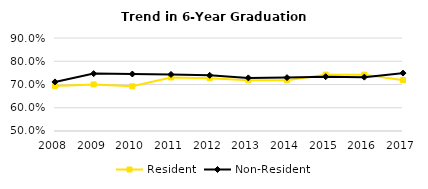
| Category | Resident | Non-Resident |
|---|---|---|
| 2008.0 | 0.694 | 0.711 |
| 2009.0 | 0.7 | 0.747 |
| 2010.0 | 0.692 | 0.745 |
| 2011.0 | 0.73 | 0.743 |
| 2012.0 | 0.727 | 0.74 |
| 2013.0 | 0.719 | 0.728 |
| 2014.0 | 0.719 | 0.73 |
| 2015.0 | 0.742 | 0.734 |
| 2016.0 | 0.742 | 0.732 |
| 2017.0 | 0.719 | 0.749 |